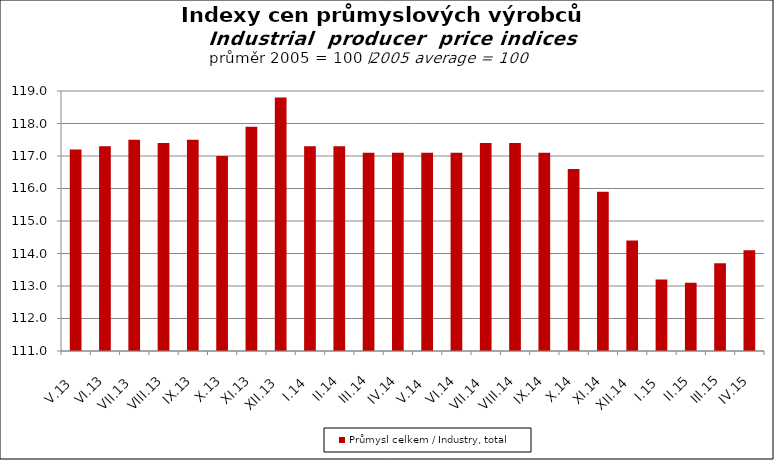
| Category | Průmysl celkem / Industry, total |
|---|---|
| V.13 | 117.2 |
| VI.13 | 117.3 |
| VII.13 | 117.5 |
| VIII.13 | 117.4 |
| IX.13 | 117.5 |
| X.13 | 117 |
| XI.13 | 117.9 |
| XII.13 | 118.8 |
| I.14 | 117.3 |
| II.14 | 117.3 |
| III.14 | 117.1 |
| IV.14 | 117.1 |
| V.14 | 117.1 |
| VI.14 | 117.1 |
| VII.14 | 117.4 |
| VIII.14 | 117.4 |
| IX.14 | 117.1 |
| X.14 | 116.6 |
| XI.14 | 115.9 |
| XII.14 | 114.4 |
| I.15 | 113.2 |
| II.15 | 113.1 |
| III.15 | 113.7 |
| IV.15 | 114.1 |